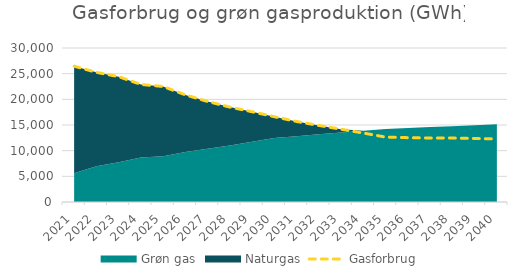
| Category | Gasforbrug |
|---|---|
| 2021.0 | 26463.883 |
| 2022.0 | 25256.57 |
| 2023.0 | 24416.852 |
| 2024.0 | 22903.708 |
| 2025.0 | 22501.37 |
| 2026.0 | 20868.445 |
| 2027.0 | 19577.338 |
| 2028.0 | 18487.621 |
| 2029.0 | 17578.487 |
| 2030.0 | 16616.782 |
| 2031.0 | 15683.167 |
| 2032.0 | 14909.303 |
| 2033.0 | 14172.532 |
| 2034.0 | 13432.204 |
| 2035.0 | 12640.674 |
| 2036.0 | 12532.159 |
| 2037.0 | 12458.134 |
| 2038.0 | 12462.276 |
| 2039.0 | 12369.989 |
| 2040.0 | 12279.823 |